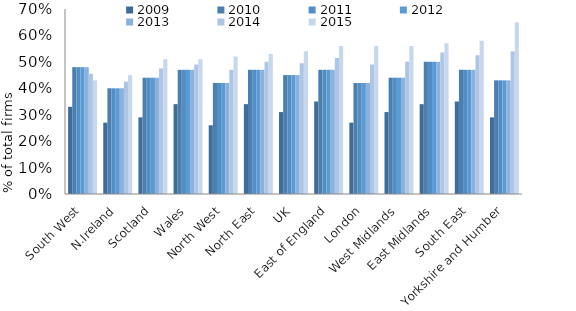
| Category | 2009 | 2010 | 2011 | 2012 | 2013 | 2014 | 2015 |
|---|---|---|---|---|---|---|---|
| South West | 0.33 | 0.48 | 0.48 | 0.48 | 0.48 | 0.455 | 0.43 |
| N.Ireland | 0.27 | 0.4 | 0.4 | 0.4 | 0.4 | 0.425 | 0.45 |
| Scotland | 0.29 | 0.44 | 0.44 | 0.44 | 0.44 | 0.475 | 0.51 |
| Wales | 0.34 | 0.47 | 0.47 | 0.47 | 0.47 | 0.49 | 0.51 |
| North West | 0.26 | 0.42 | 0.42 | 0.42 | 0.42 | 0.47 | 0.52 |
| North East | 0.34 | 0.47 | 0.47 | 0.47 | 0.47 | 0.5 | 0.53 |
| UK | 0.31 | 0.45 | 0.45 | 0.45 | 0.45 | 0.495 | 0.54 |
| East of England | 0.35 | 0.47 | 0.47 | 0.47 | 0.47 | 0.515 | 0.56 |
| London | 0.27 | 0.42 | 0.42 | 0.42 | 0.42 | 0.49 | 0.56 |
| West Midlands | 0.31 | 0.44 | 0.44 | 0.44 | 0.44 | 0.5 | 0.56 |
| East Midlands | 0.34 | 0.5 | 0.5 | 0.5 | 0.5 | 0.535 | 0.57 |
| South East | 0.35 | 0.47 | 0.47 | 0.47 | 0.47 | 0.525 | 0.58 |
| Yorkshire and Humber | 0.29 | 0.43 | 0.43 | 0.43 | 0.43 | 0.54 | 0.65 |